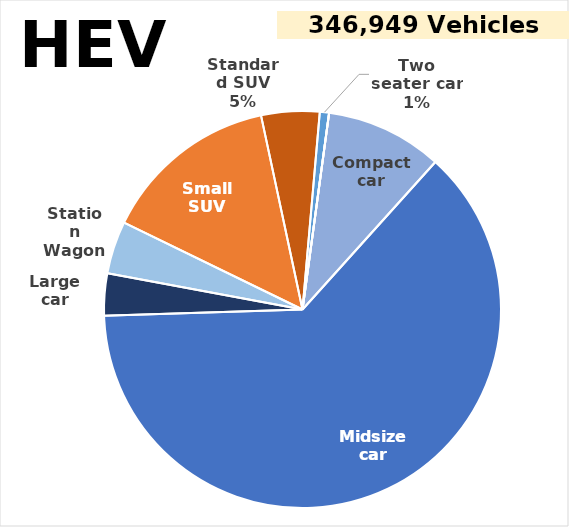
| Category | Series 0 |
|---|---|
| Two seater car | 0.008 |
| Minicompact car | 0 |
| Subcompact car | 0 |
| Compact car | 0.095 |
| Midsize car | 0.628 |
| Large car | 0.034 |
| Station Wagon | 0.043 |
| Small SUV | 0.144 |
| Standard SUV | 0.047 |